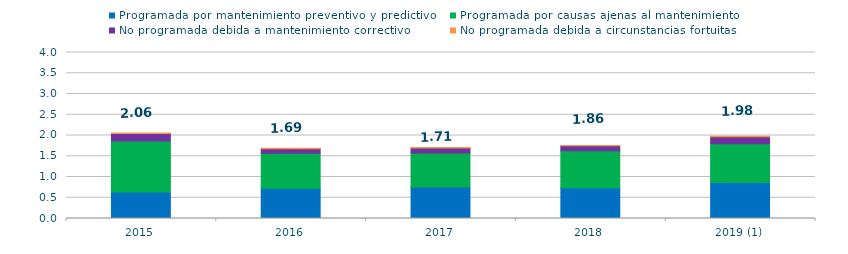
| Category | Programada por mantenimiento preventivo y predictivo | Programada por causas ajenas al mantenimiento  | No programada debida a mantenimiento correctivo  | No programada debida a circunstancias fortuitas  |
|---|---|---|---|---|
| 2015 | 0.64 | 1.23 | 0.18 | 0.01 |
| 2016 | 0.73 | 0.84 | 0.11 | 0.01 |
| 2017 | 0.76 | 0.82 | 0.12 | 0.01 |
| 2018 | 0.74 | 0.89 | 0.12 | 0.01 |
| 2019 (1) | 0.87 | 0.93 | 0.17 | 0.01 |